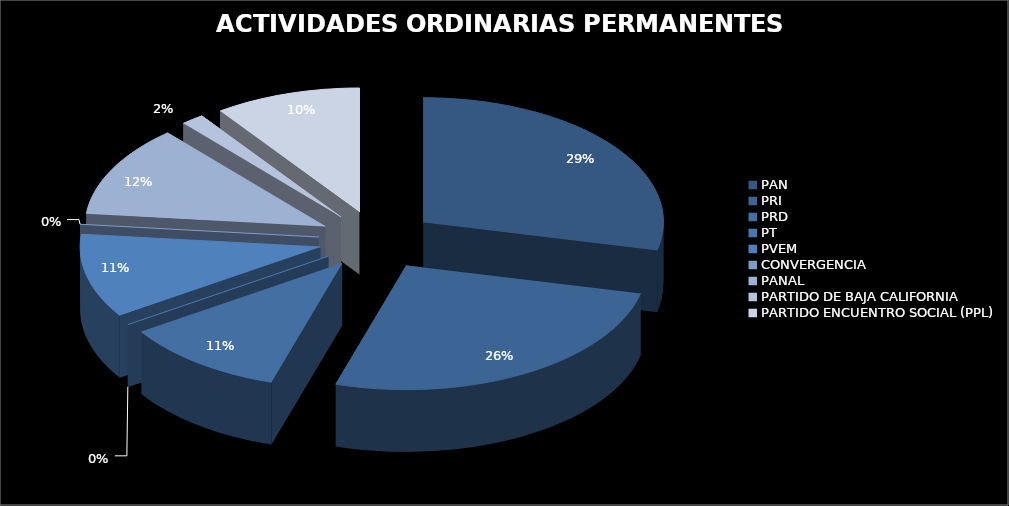
| Category | Series 0 |
|---|---|
| PAN | 3449311.13 |
| PRI | 3146188.2 |
| PRD | 1320921.04 |
| PT | 0 |
| PVEM | 1316161.92 |
| CONVERGENCIA | 0 |
| PANAL | 1441094.31 |
| PARTIDO DE BAJA CALIFORNIA | 187398.56 |
| PARTIDO ENCUENTRO SOCIAL (PPL) | 1184987.48 |